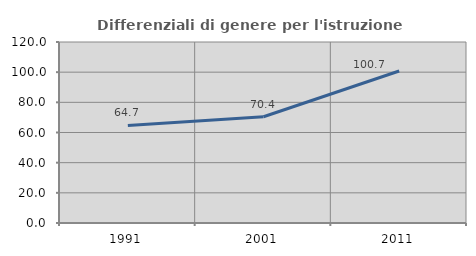
| Category | Differenziali di genere per l'istruzione superiore |
|---|---|
| 1991.0 | 64.658 |
| 2001.0 | 70.442 |
| 2011.0 | 100.748 |